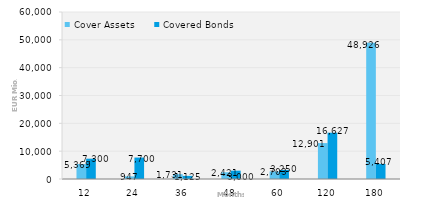
| Category | Cover Assets | Covered Bonds |
|---|---|---|
| 12.0 | 5368.86 | 7300 |
| 24.0 | 946.64 | 7700 |
| 36.0 | 1731.41 | 1125 |
| 48.0 | 2420.61 | 3000 |
| 60.0 | 2703.37 | 3250 |
| 120.0 | 12901.04 | 16627.2 |
| 180.0 | 48926.13 | 5407 |